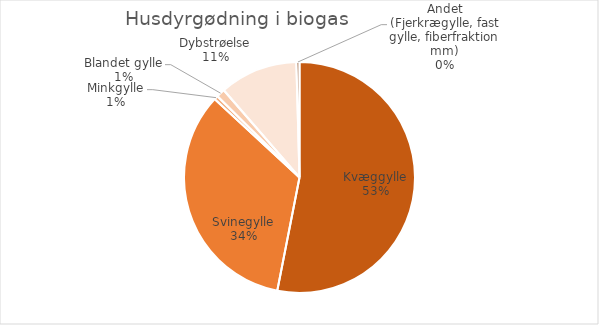
| Category | Series 0 |
|---|---|
| Kvæggylle | 5717080.21 |
| Svinegylle | 3638307.98 |
| Minkgylle | 59708.21 |
| Blandet gylle | 129493.8 |
| Dybstrøelse | 1177499.5 |
| Andet (Fjerkrægylle, fast gylle, fiberfraktion mm) | 47207.62 |